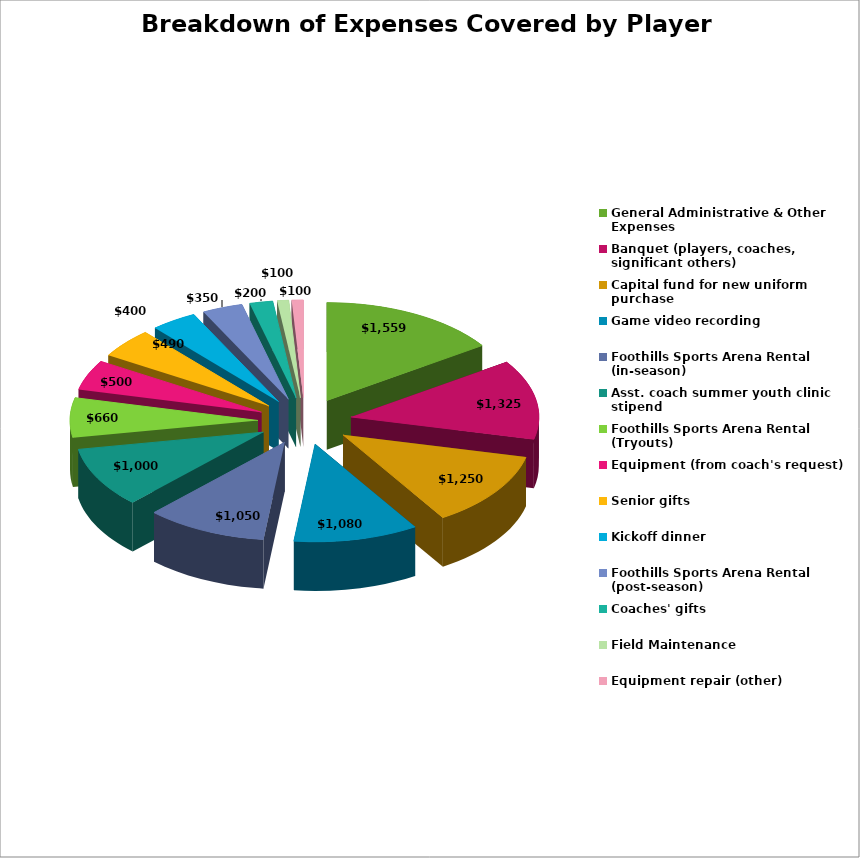
| Category | Series 0 |
|---|---|
| General Administrative & Other Expenses | 1559 |
| Banquet (players, coaches, significant others) | 1325 |
| Capital fund for new uniform purchase | 1250 |
| Game video recording | 1080 |
| Foothills Sports Arena Rental (in-season) | 1050 |
| Asst. coach summer youth clinic stipend | 1000 |
| Foothills Sports Arena Rental (Tryouts) | 660 |
| Equipment (from coach's request) | 500 |
| Senior gifts | 490 |
| Kickoff dinner | 400 |
| Foothills Sports Arena Rental (post-season) | 350 |
| Coaches' gifts | 200 |
| Field Maintenance | 100 |
| Equipment repair (other) | 100 |